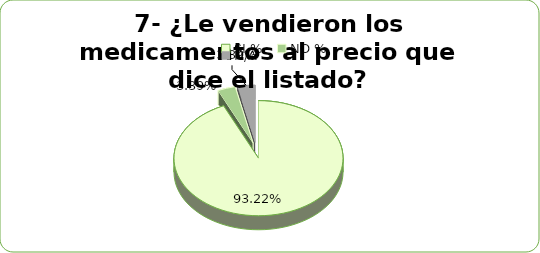
| Category | Series 0 |
|---|---|
| SI % | 0.932 |
| NO % | 0.034 |
| N/A | 0.034 |